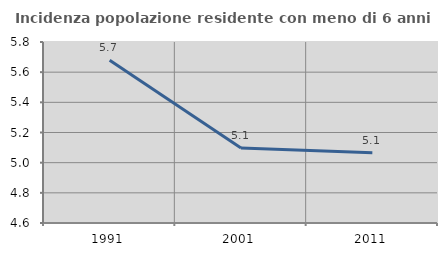
| Category | Incidenza popolazione residente con meno di 6 anni |
|---|---|
| 1991.0 | 5.679 |
| 2001.0 | 5.097 |
| 2011.0 | 5.067 |